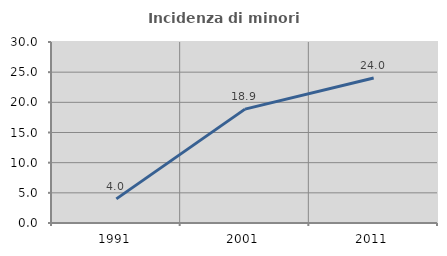
| Category | Incidenza di minori stranieri |
|---|---|
| 1991.0 | 4 |
| 2001.0 | 18.878 |
| 2011.0 | 24.044 |